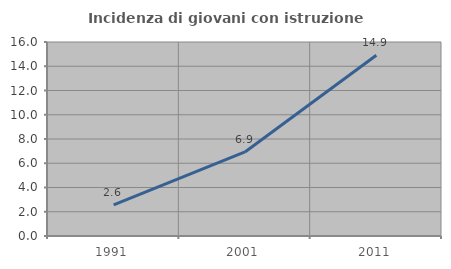
| Category | Incidenza di giovani con istruzione universitaria |
|---|---|
| 1991.0 | 2.564 |
| 2001.0 | 6.931 |
| 2011.0 | 14.907 |